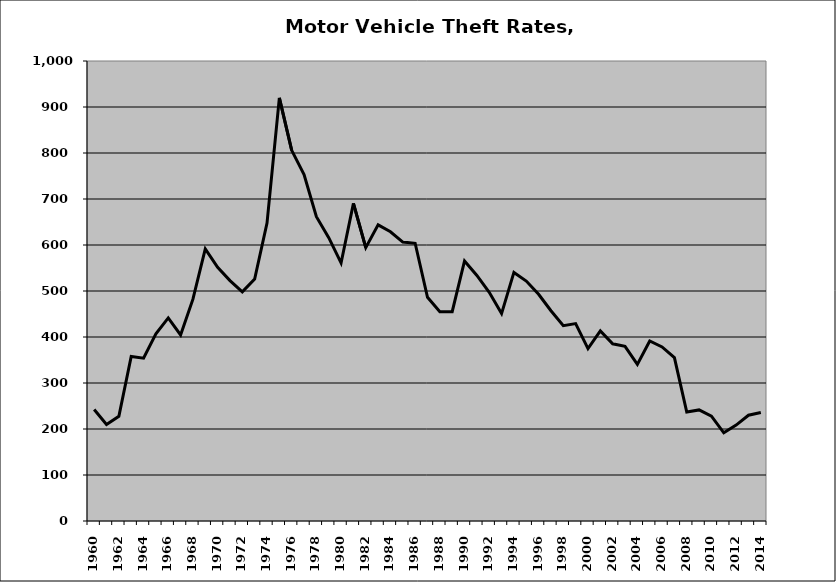
| Category | Motor Vehicle |
|---|---|
| 1960.0 | 242.299 |
| 1961.0 | 209.829 |
| 1962.0 | 227.642 |
| 1963.0 | 357.661 |
| 1964.0 | 354 |
| 1965.0 | 407.115 |
| 1966.0 | 441.544 |
| 1967.0 | 404.412 |
| 1968.0 | 482.31 |
| 1969.0 | 591.489 |
| 1970.0 | 551.34 |
| 1971.0 | 522.684 |
| 1972.0 | 498.154 |
| 1973.0 | 526.061 |
| 1974.0 | 647.774 |
| 1975.0 | 919.886 |
| 1976.0 | 805.759 |
| 1977.0 | 753.317 |
| 1978.0 | 661.538 |
| 1979.0 | 616.01 |
| 1980.0 | 560.955 |
| 1981.0 | 690.534 |
| 1982.0 | 594.292 |
| 1983.0 | 643.841 |
| 1984.0 | 628.8 |
| 1985.0 | 606.334 |
| 1986.0 | 603.745 |
| 1987.0 | 486.286 |
| 1988.0 | 454.971 |
| 1989.0 | 455.028 |
| 1990.0 | 565.41 |
| 1991.0 | 533.86 |
| 1992.0 | 497.104 |
| 1993.0 | 450.918 |
| 1994.0 | 540.429 |
| 1995.0 | 521.689 |
| 1996.0 | 492.916 |
| 1997.0 | 457.143 |
| 1998.0 | 424.593 |
| 1999.0 | 429.056 |
| 2000.0 | 374.841 |
| 2001.0 | 413.175 |
| 2002.0 | 385.202 |
| 2003.0 | 379.62 |
| 2004.0 | 340.552 |
| 2005.0 | 391.253 |
| 2006.0 | 378.328 |
| 2007.0 | 355.096 |
| 2008.0 | 236.876 |
| 2009.0 | 241.527 |
| 2010.0 | 227.954 |
| 2011.0 | 191.75 |
| 2012.0 | 208.406 |
| 2013.0 | 229.906 |
| 2014.0 | 236.042 |